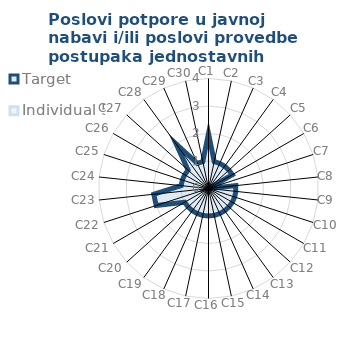
| Category | Target | Individual 5 |
|---|---|---|
| C1 | 2 | 0 |
| C2 | 1 | 0 |
| C3 | 1 | 0 |
| C4 | 1 | 0 |
| C5 | 1 | 0 |
| C6 | 1 | 0 |
| C7 | 0 | 0 |
| C8 | 1 | 0 |
| C9 | 1 | 0 |
| C10 | 1 | 0 |
| C11 | 1 | 0 |
| C12 | 1 | 0 |
| C13 | 1 | 0 |
| C14 | 1 | 0 |
| C15 | 1 | 0 |
| C16 | 1 | 0 |
| C17 | 1 | 0 |
| C18 | 1 | 0 |
| C19 | 1 | 0 |
| C20 | 1 | 0 |
| C21 | 1 | 0 |
| C22 | 2 | 0 |
| C23 | 2 | 0 |
| C24 | 1 | 0 |
| C25 | 1 | 0 |
| C26 | 1 | 0 |
| C27 | 1 | 0 |
| C28 | 2 | 0 |
| C29 | 1 | 0 |
| C30 | 1 | 0 |